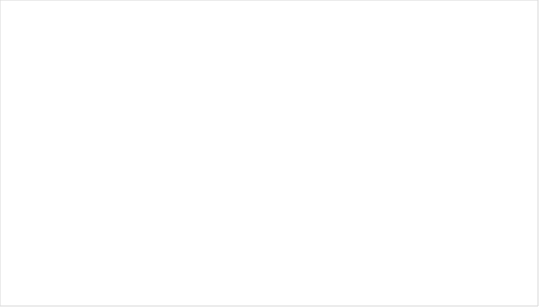
| Category | Average of 
Implied Return | Average of Alpha |
|---|---|---|
| High P/B | 0.024 | -0.001 |
| Low P/B | 0.003 | -0.017 |
| Medium P/B | 0.021 | 0 |